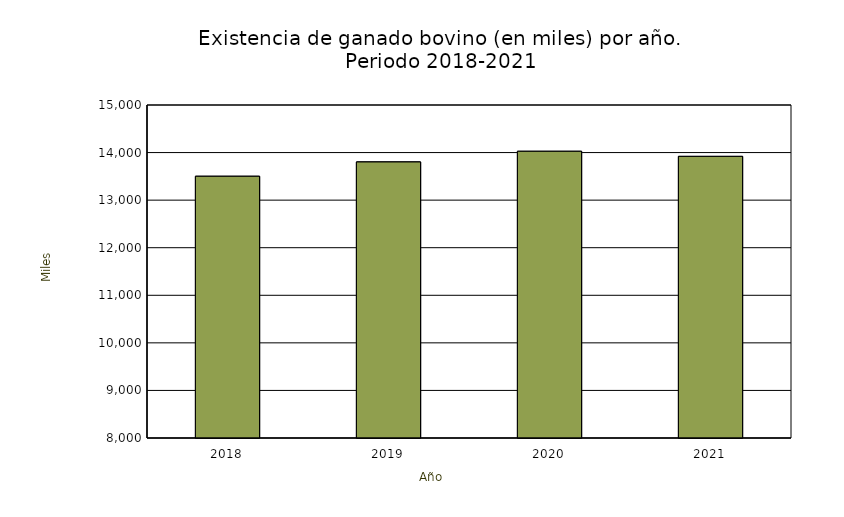
| Category | Series 0 |
|---|---|
| 2018.0 | 13500.965 |
| 2019.0 | 13801.993 |
| 2020.0 | 14026.143 |
| 2021.0 | 13919.507 |